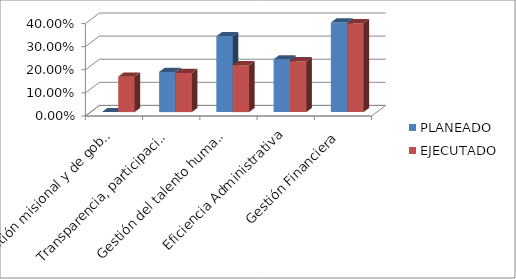
| Category | PLANEADO | EJECUTADO |
|---|---|---|
| Gestión misional y de gobierno | 0 | 0.154 |
| Transparencia, participación y servicio al ciudadano | 0.174 | 0.17 |
| Gestión del talento humano | 0.328 | 0.203 |
| Eficiencia Administrativa | 0.228 | 0.22 |
| Gestión Financiera | 0.388 | 0.385 |